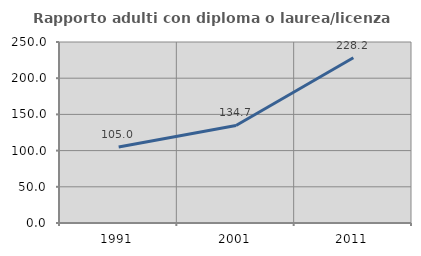
| Category | Rapporto adulti con diploma o laurea/licenza media  |
|---|---|
| 1991.0 | 105 |
| 2001.0 | 134.703 |
| 2011.0 | 228.226 |